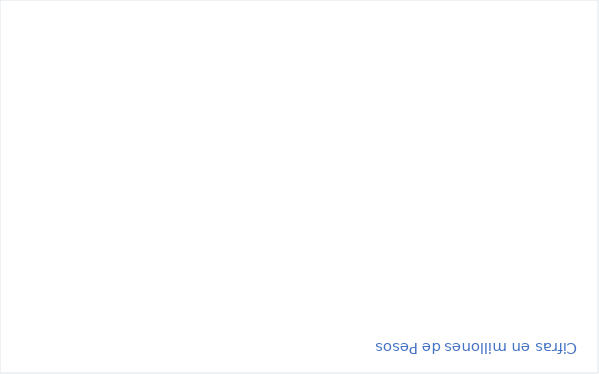
| Category | RESERVAS CONSTITUIDAS
 | CANCELACIONES RESERVAS PRESUPUESTALES
  | PAGOS
ACUMULADOS
 |
|---|---|---|---|
| Total | 55446.915 | 0 | 8351.871 |